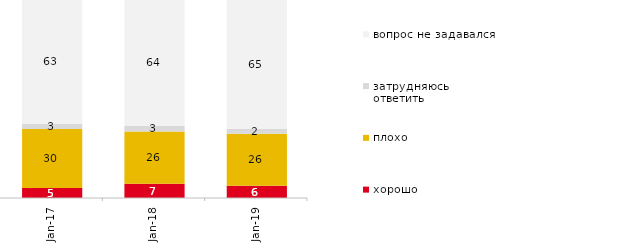
| Category | хорошо | плохо | затрудняюсь ответить | вопрос не задавался |
|---|---|---|---|---|
| 2017-04-01 | 5.1 | 29.7 | 2.7 | 62.5 |
| 2018-04-01 | 7.25 | 26.3 | 2.85 | 63.6 |
| 2019-04-01 | 6.139 | 26.287 | 2.376 | 65.198 |